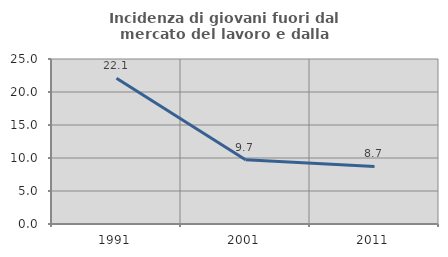
| Category | Incidenza di giovani fuori dal mercato del lavoro e dalla formazione  |
|---|---|
| 1991.0 | 22.099 |
| 2001.0 | 9.74 |
| 2011.0 | 8.73 |